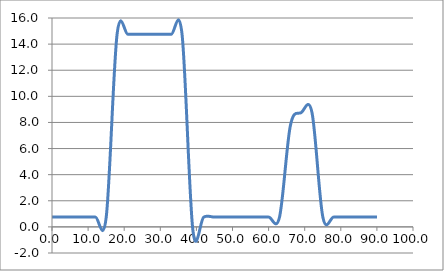
| Category | Elevation (in.) |
|---|---|
| 0.024 | 0.75 |
| 3.024 | 0.75 |
| 6.024 | 0.75 |
| 9.024000000000001 | 0.75 |
| 12.024000000000001 | 0.75 |
| 15.024000000000001 | 0.75 |
| 18.024 | 14.75 |
| 21.024 | 14.75 |
| 24.023999999999997 | 14.75 |
| 27.023999999999997 | 14.75 |
| 30.023999999999997 | 14.75 |
| 33.024 | 14.75 |
| 36.024 | 14.75 |
| 39.024 | -0.25 |
| 42.024 | 0.75 |
| 45.024 | 0.75 |
| 48.024 | 0.75 |
| 51.024 | 0.75 |
| 54.024 | 0.75 |
| 57.024 | 0.75 |
| 60.024 | 0.75 |
| 63.024 | 0.75 |
| 66.024 | 7.75 |
| 69.024 | 8.75 |
| 72.024 | 8.75 |
| 75.024 | 0.75 |
| 78.024 | 0.75 |
| 81.024 | 0.75 |
| 84.024 | 0.75 |
| 87.024 | 0.75 |
| 90.024 | 0.75 |